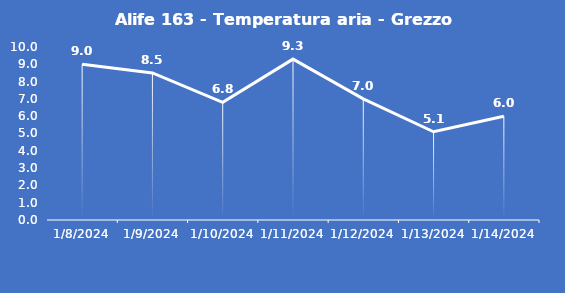
| Category | Alife 163 - Temperatura aria - Grezzo (°C) |
|---|---|
| 1/8/24 | 9 |
| 1/9/24 | 8.5 |
| 1/10/24 | 6.8 |
| 1/11/24 | 9.3 |
| 1/12/24 | 7 |
| 1/13/24 | 5.1 |
| 1/14/24 | 6 |